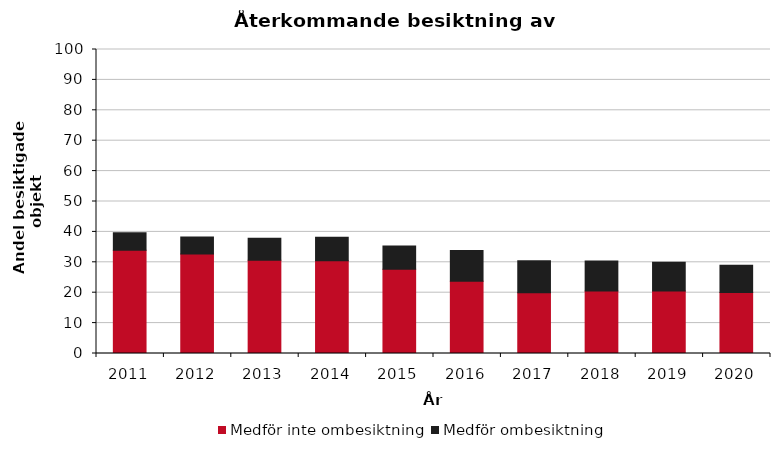
| Category | Medför inte ombesiktning | Medför ombesiktning |
|---|---|---|
| 2011.0 | 34 | 5.7 |
| 2012.0 | 32.7 | 5.6 |
| 2013.0 | 30.7 | 7.2 |
| 2014.0 | 30.5 | 7.7 |
| 2015.0 | 27.7 | 7.7 |
| 2016.0 | 23.8 | 10.1 |
| 2017.0 | 20 | 10.5 |
| 2018.0 | 20.6 | 9.8 |
| 2019.0 | 20.6 | 9.4 |
| 2020.0 | 20.1 | 8.9 |